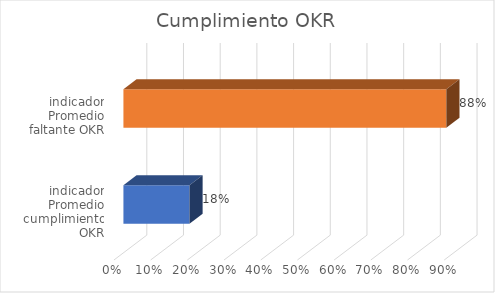
| Category | Series 0 |
|---|---|
| indicador Promedio cumplimiento OKR | 0.18 |
| indicador Promedio faltante OKR | 0.88 |